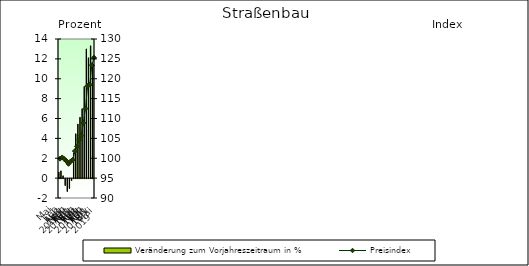
| Category | Veränderung zum Vorjahreszeitraum in % |
|---|---|
| 0 | 0.607 |
| 1 | 0.731 |
| 2 | 0.24 |
| 3 | -0.7 |
| 4 | -1.301 |
| 5 | -0.998 |
| 6 | -0.2 |
| 7 | 2.518 |
| 8 | 4.462 |
| 9 | 5.444 |
| 10 | 6.124 |
| 11 | 6.974 |
| 12 | 9.223 |
| 13 | 13.002 |
| 14 | 12.11 |
| 15 | 13.315 |
| 16 | 11.378 |